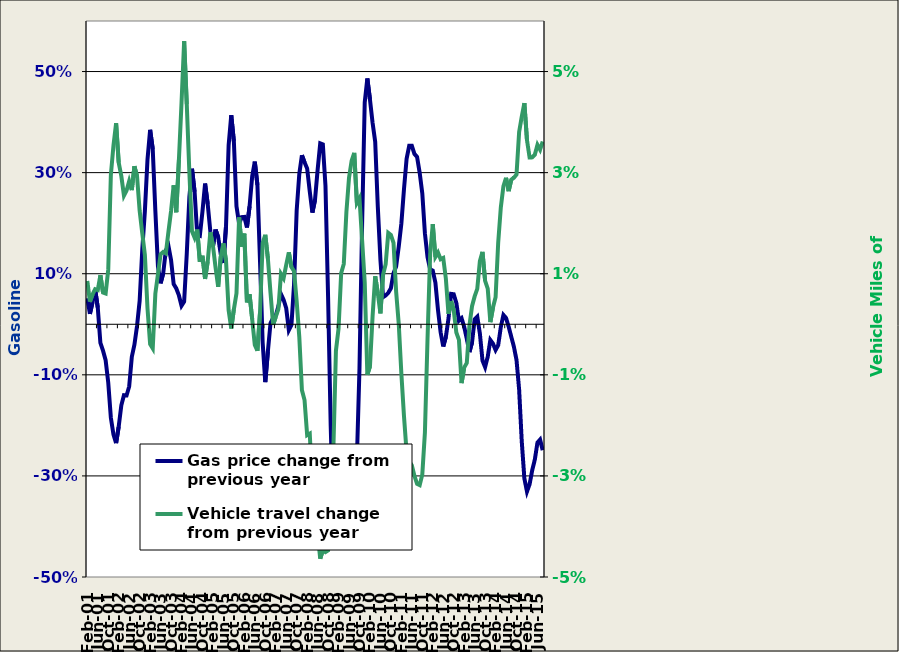
| Category | Gas price change from previous year |
|---|---|
| 2001-02-01 | 0.051 |
| 2001-03-01 | 0.021 |
| 2001-04-01 | 0.044 |
| 2001-05-01 | 0.069 |
| 2001-06-01 | 0.033 |
| 2001-07-01 | -0.037 |
| 2001-08-01 | -0.052 |
| 2001-09-01 | -0.071 |
| 2001-10-01 | -0.115 |
| 2001-11-01 | -0.185 |
| 2001-12-01 | -0.218 |
| 2002-01-01 | -0.235 |
| 2002-02-01 | -0.202 |
| 2002-03-01 | -0.16 |
| 2002-04-01 | -0.14 |
| 2002-05-01 | -0.141 |
| 2002-06-01 | -0.123 |
| 2002-07-01 | -0.065 |
| 2002-08-01 | -0.04 |
| 2002-09-01 | -0.003 |
| 2002-10-01 | 0.046 |
| 2002-11-01 | 0.148 |
| 2002-12-01 | 0.224 |
| 2003-01-01 | 0.326 |
| 2003-02-01 | 0.385 |
| 2003-03-01 | 0.347 |
| 2003-04-01 | 0.224 |
| 2003-05-01 | 0.114 |
| 2003-06-01 | 0.081 |
| 2003-07-01 | 0.101 |
| 2003-08-01 | 0.146 |
| 2003-09-01 | 0.155 |
| 2003-10-01 | 0.127 |
| 2003-11-01 | 0.079 |
| 2003-12-01 | 0.071 |
| 2004-01-01 | 0.057 |
| 2004-02-01 | 0.037 |
| 2004-03-01 | 0.045 |
| 2004-04-01 | 0.139 |
| 2004-05-01 | 0.252 |
| 2004-06-01 | 0.308 |
| 2004-07-01 | 0.262 |
| 2004-08-01 | 0.177 |
| 2004-09-01 | 0.175 |
| 2004-10-01 | 0.223 |
| 2004-11-01 | 0.278 |
| 2004-12-01 | 0.238 |
| 2005-01-01 | 0.184 |
| 2005-02-01 | 0.154 |
| 2005-03-01 | 0.187 |
| 2005-04-01 | 0.173 |
| 2005-05-01 | 0.138 |
| 2005-06-01 | 0.121 |
| 2005-07-01 | 0.194 |
| 2005-08-01 | 0.354 |
| 2005-09-01 | 0.414 |
| 2005-10-01 | 0.362 |
| 2005-11-01 | 0.233 |
| 2005-12-01 | 0.199 |
| 2006-01-01 | 0.212 |
| 2006-02-01 | 0.212 |
| 2006-03-01 | 0.192 |
| 2006-04-01 | 0.233 |
| 2006-05-01 | 0.293 |
| 2006-06-01 | 0.322 |
| 2006-07-01 | 0.276 |
| 2006-08-01 | 0.124 |
| 2006-09-01 | -0.036 |
| 2006-10-01 | -0.114 |
| 2006-11-01 | -0.053 |
| 2006-12-01 | 0.002 |
| 2007-01-01 | 0.013 |
| 2007-02-01 | 0.017 |
| 2007-03-01 | 0.035 |
| 2007-04-01 | 0.06 |
| 2007-05-01 | 0.049 |
| 2007-06-01 | 0.032 |
| 2007-07-01 | -0.011 |
| 2007-08-01 | -0.001 |
| 2007-09-01 | 0.08 |
| 2007-10-01 | 0.225 |
| 2007-11-01 | 0.298 |
| 2007-12-01 | 0.334 |
| 2008-01-01 | 0.32 |
| 2008-02-01 | 0.308 |
| 2008-03-01 | 0.262 |
| 2008-04-01 | 0.221 |
| 2008-05-01 | 0.246 |
| 2008-06-01 | 0.305 |
| 2008-07-01 | 0.358 |
| 2008-08-01 | 0.356 |
| 2008-09-01 | 0.274 |
| 2008-10-01 | 0.054 |
| 2008-11-01 | -0.201 |
| 2008-12-01 | -0.384 |
| 2009-01-01 | -0.406 |
| 2009-02-01 | -0.393 |
| 2009-03-01 | -0.39 |
| 2009-04-01 | -0.401 |
| 2009-05-01 | -0.385 |
| 2009-06-01 | -0.376 |
| 2009-07-01 | -0.346 |
| 2009-08-01 | -0.329 |
| 2009-09-01 | -0.268 |
| 2009-10-01 | -0.087 |
| 2009-11-01 | 0.199 |
| 2009-12-01 | 0.439 |
| 2010-01-10 | 0.486 |
| 2010-02-10 | 0.445 |
| 2010-03-10 | 0.399 |
| 2010-04-10 | 0.361 |
| 2010-05-10 | 0.232 |
| 2010-06-10 | 0.127 |
| 2010-07-10 | 0.054 |
| 2010-08-10 | 0.057 |
| 2010-09-10 | 0.062 |
| 2010-10-10 | 0.071 |
| 2010-11-10 | 0.101 |
| 2010-12-10 | 0.114 |
| 2011-01-01 | 0.154 |
| 2011-02-01 | 0.199 |
| 2011-03-01 | 0.267 |
| 2011-04-01 | 0.327 |
| 2011-05-01 | 0.353 |
| 2011-06-01 | 0.353 |
| 2011-07-01 | 0.337 |
| 2011-08-01 | 0.331 |
| 2011-09-01 | 0.3 |
| 2011-10-01 | 0.259 |
| 2011-11-01 | 0.18 |
| 2011-12-01 | 0.133 |
| 2012-01-01 | 0.109 |
| 2012-02-01 | 0.106 |
| 2012-03-01 | 0.083 |
| 2012-04-01 | 0.028 |
| 2012-05-12 | -0.016 |
| 2012-06-12 | -0.044 |
| 2012-07-12 | -0.025 |
| 2012-08-12 | 0.011 |
| 2012-09-12 | 0.06 |
| 2012-10-12 | 0.059 |
| 2012-11-12 | 0.042 |
| 2012-12-12 | 0.007 |
| 2013-01-12 | 0.012 |
| 2013-02-12 | -0.005 |
| 2013-03-12 | -0.029 |
| 2013-04-12 | -0.055 |
| 2013-05-12 | -0.036 |
| 2013-06-12 | 0.01 |
| 2013-07-12 | 0.015 |
| 2013-08-12 | -0.018 |
| 2013-09-12 | -0.072 |
| 2013-10-12 | -0.085 |
| 2013-11-12 | -0.064 |
| 2013-12-12 | -0.031 |
| 2014-01-12 | -0.038 |
| 2014-02-12 | -0.051 |
| 2014-03-12 | -0.041 |
| 2014-04-12 | -0.005 |
| 2014-05-12 | 0.018 |
| 2014-06-12 | 0.012 |
| 2014-07-12 | -0.005 |
| 2014-08-12 | -0.025 |
| 2014-09-12 | -0.044 |
| 2014-10-12 | -0.071 |
| 2014-11-12 | -0.129 |
| 2014-12-12 | -0.232 |
| 2015-01-01 | -0.305 |
| 2015-02-01 | -0.331 |
| 2015-03-01 | -0.316 |
| 2015-04-01 | -0.289 |
| 2015-05-01 | -0.268 |
| 2015-06-01 | -0.234 |
| 2015-07-01 | -0.228 |
| 2015-08-01 | -0.249 |